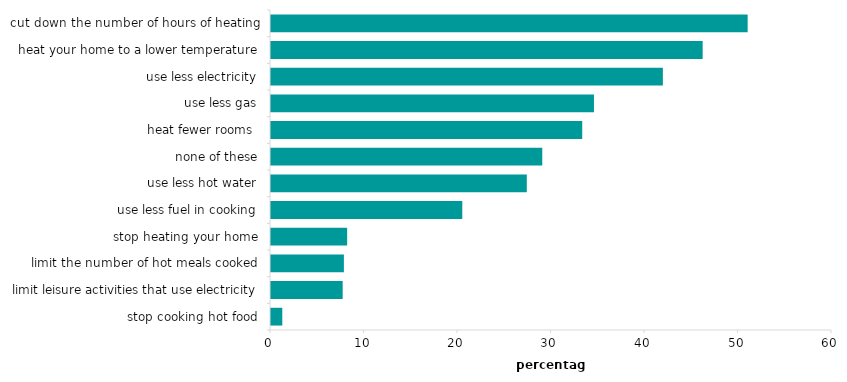
| Category | Series 0 |
|---|---|
| stop cooking hot food | 1.208 |
| limit leisure activities that use electricity | 7.667 |
| limit the number of hot meals cooked | 7.796 |
| stop heating your home | 8.144 |
| use less fuel in cooking | 20.458 |
| use less hot water | 27.357 |
| none of these | 29.013 |
| heat fewer rooms  | 33.286 |
| use less gas | 34.542 |
| use less electricity | 41.911 |
| heat your home to a lower temperature | 46.167 |
| cut down the number of hours of heating | 50.979 |